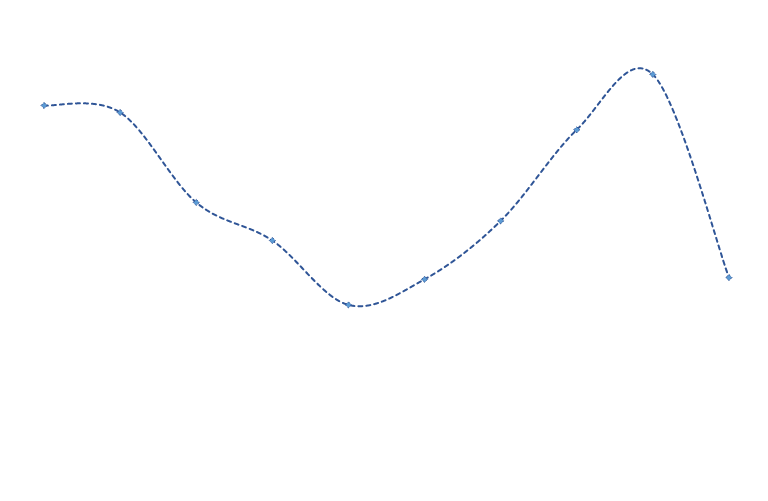
| Category | Series 0 |
|---|---|
| 0 | 24753.24 |
| 1 | 24684.287 |
| 2 | 23794.236 |
| 3 | 23417.721 |
| 4 | 22781.156 |
| 5 | 23034.35 |
| 6 | 23611.951 |
| 7 | 24513.288 |
| 8 | 25060.887 |
| 9 | 23051.647 |